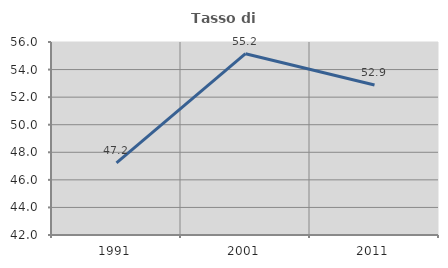
| Category | Tasso di occupazione   |
|---|---|
| 1991.0 | 47.239 |
| 2001.0 | 55.152 |
| 2011.0 | 52.88 |